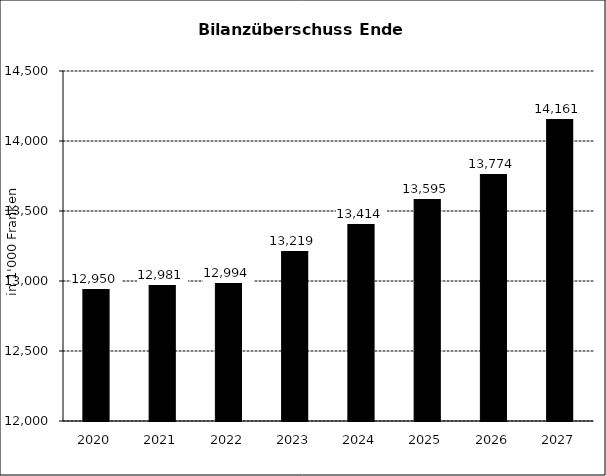
| Category | Bilanzüberschuss Ende Jahr |
|---|---|
| 2020.0 | 12950 |
| 2021.0 | 12981 |
| 2022.0 | 12994 |
| 2023.0 | 13219.362 |
| 2024.0 | 13414.109 |
| 2025.0 | 13595.067 |
| 2026.0 | 13774.276 |
| 2027.0 | 14161.05 |